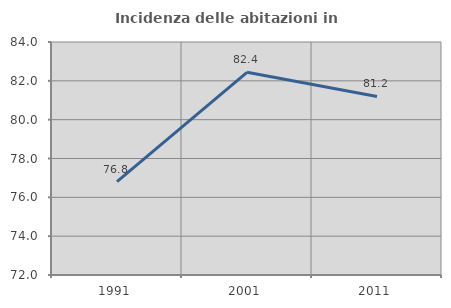
| Category | Incidenza delle abitazioni in proprietà  |
|---|---|
| 1991.0 | 76.804 |
| 2001.0 | 82.438 |
| 2011.0 | 81.195 |